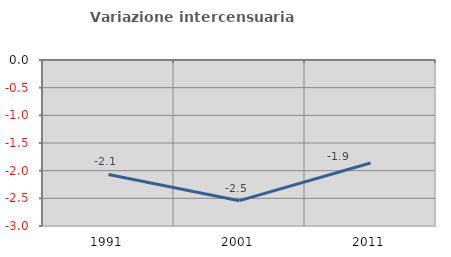
| Category | Variazione intercensuaria annua |
|---|---|
| 1991.0 | -2.068 |
| 2001.0 | -2.542 |
| 2011.0 | -1.862 |